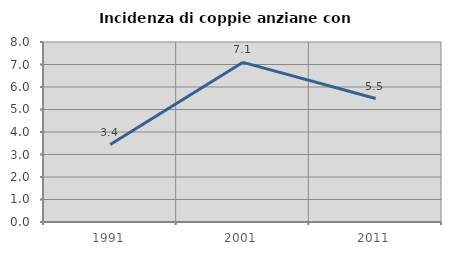
| Category | Incidenza di coppie anziane con figli |
|---|---|
| 1991.0 | 3.442 |
| 2001.0 | 7.097 |
| 2011.0 | 5.486 |